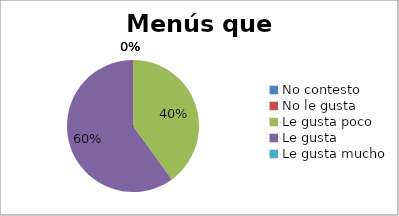
| Category | Series 0 |
|---|---|
| No contesto | 0 |
| No le gusta | 0 |
| Le gusta poco | 2 |
| Le gusta | 3 |
| Le gusta mucho | 0 |